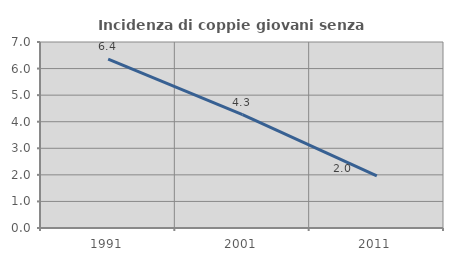
| Category | Incidenza di coppie giovani senza figli |
|---|---|
| 1991.0 | 6.354 |
| 2001.0 | 4.271 |
| 2011.0 | 1.964 |